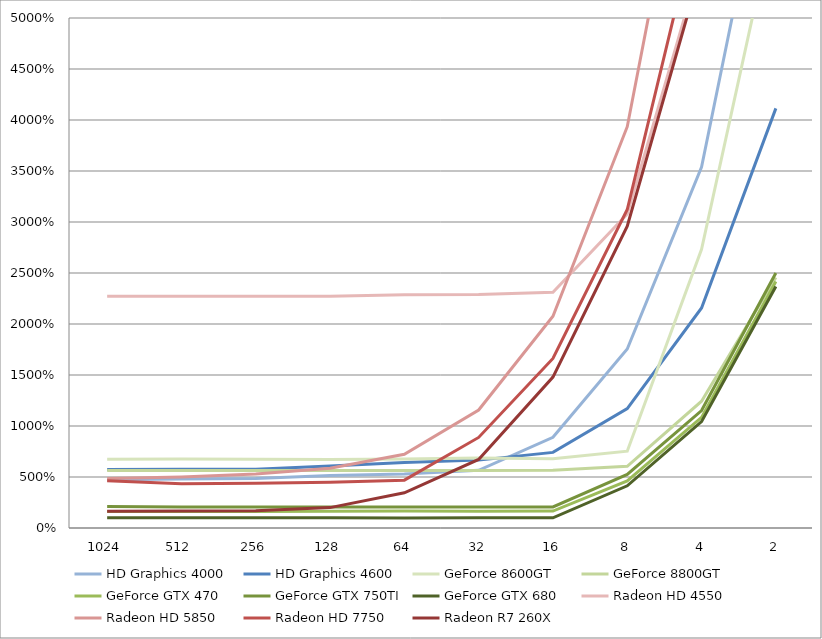
| Category | HD Graphics 4000 | HD Graphics 4600 | GeForce 8600GT | GeForce 8800GT | GeForce GTX 470 | GeForce GTX 750TI | GeForce GTX 680 | Radeon HD 4550 | Radeon HD 5850 | Radeon HD 7750 | Radeon R7 260X |
|---|---|---|---|---|---|---|---|---|---|---|---|
| 1024.0 | 4.741 | 5.741 | 6.741 | 5.638 | 1.621 | 2.103 | 1 | 22.724 | 4.862 | 4.621 | 1.638 |
| 512.0 | 4.793 | 5.759 | 6.759 | 5.638 | 1.621 | 2.069 | 1 | 22.724 | 5 | 4.345 | 1.655 |
| 256.0 | 4.862 | 5.759 | 6.741 | 5.638 | 1.621 | 2.069 | 1 | 22.724 | 5.293 | 4.397 | 1.69 |
| 128.0 | 5.155 | 6.069 | 6.724 | 5.638 | 1.638 | 2.069 | 1 | 22.724 | 5.862 | 4.483 | 2 |
| 64.0 | 5.293 | 6.431 | 6.759 | 5.638 | 1.655 | 2.069 | 0.983 | 22.862 | 7.224 | 4.69 | 3.448 |
| 32.0 | 5.655 | 6.655 | 6.862 | 5.638 | 1.638 | 2.069 | 1 | 22.897 | 11.569 | 8.879 | 6.724 |
| 16.0 | 8.897 | 7.414 | 6.793 | 5.655 | 1.655 | 2.069 | 1 | 23.121 | 20.759 | 16.621 | 14.793 |
| 8.0 | 17.552 | 11.707 | 7.534 | 6.052 | 4.621 | 5.259 | 4.138 | 30.776 | 39.345 | 31.224 | 29.586 |
| 4.0 | 35.379 | 21.569 | 27.328 | 12.431 | 10.845 | 11.517 | 10.431 | 55.776 | 76.948 | 61.414 | 55.086 |
| 2.0 | 71 | 41.138 | 60.517 | 24.552 | 24.172 | 25 | 23.672 | 107.707 | 150.724 | 122.672 | 115.741 |